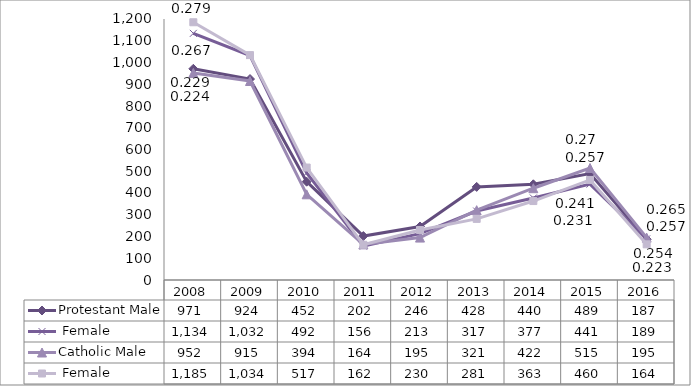
| Category | Protestant | Catholic |
|---|---|---|
| 2008.0 | 1134 | 1185 |
| 2009.0 | 1032 | 1034 |
| 2010.0 | 492 | 517 |
| 2011.0 | 156 | 162 |
| 2012.0 | 213 | 230 |
| 2013.0 | 317 | 281 |
| 2014.0 | 377 | 363 |
| 2015.0 | 441 | 460 |
| 2016.0 | 189 | 164 |